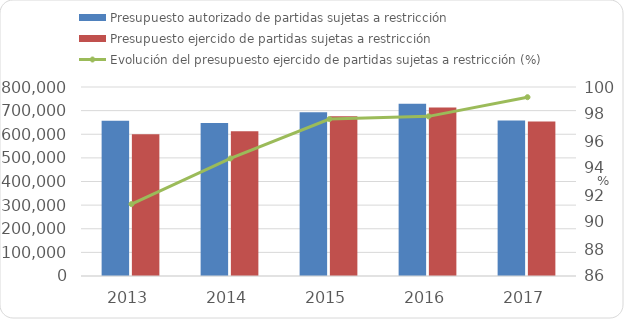
| Category | Presupuesto autorizado de partidas sujetas a restricción | Presupuesto ejercido de partidas sujetas a restricción  |
|---|---|---|
| 2013 | 657148.1 | 600163.1 |
| 2014 | 647302.9 | 613052.1 |
| 2015 | 692840.462 | 676403.338 |
| 2016 | 729594.261 | 713725.8 |
| 2017 | 658646.191 | 653670.792 |